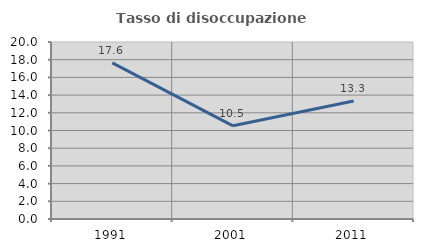
| Category | Tasso di disoccupazione giovanile  |
|---|---|
| 1991.0 | 17.647 |
| 2001.0 | 10.526 |
| 2011.0 | 13.333 |